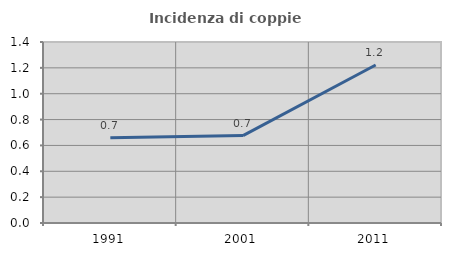
| Category | Incidenza di coppie miste |
|---|---|
| 1991.0 | 0.66 |
| 2001.0 | 0.676 |
| 2011.0 | 1.222 |